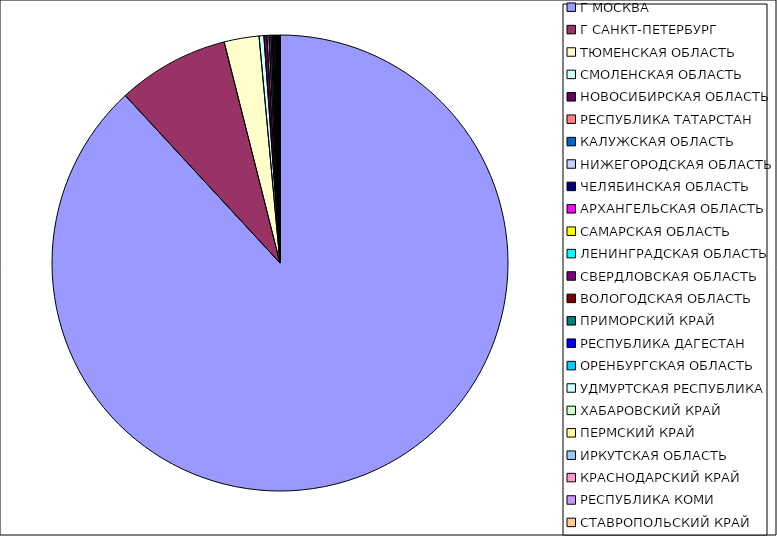
| Category | Оборот |
|---|---|
| Г МОСКВА | 0.881 |
| Г САНКТ-ПЕТЕРБУРГ | 0.079 |
| ТЮМЕНСКАЯ ОБЛАСТЬ | 0.025 |
| СМОЛЕНСКАЯ ОБЛАСТЬ | 0.003 |
| НОВОСИБИРСКАЯ ОБЛАСТЬ | 0.002 |
| РЕСПУБЛИКА ТАТАРСТАН | 0.001 |
| КАЛУЖСКАЯ ОБЛАСТЬ | 0.001 |
| НИЖЕГОРОДСКАЯ ОБЛАСТЬ | 0.001 |
| ЧЕЛЯБИНСКАЯ ОБЛАСТЬ | 0.001 |
| АРХАНГЕЛЬСКАЯ ОБЛАСТЬ | 0.001 |
| САМАРСКАЯ ОБЛАСТЬ | 0.001 |
| ЛЕНИНГРАДСКАЯ ОБЛАСТЬ | 0 |
| СВЕРДЛОВСКАЯ ОБЛАСТЬ | 0 |
| ВОЛОГОДСКАЯ ОБЛАСТЬ | 0 |
| ПРИМОРСКИЙ КРАЙ | 0 |
| РЕСПУБЛИКА ДАГЕСТАН | 0 |
| ОРЕНБУРГСКАЯ ОБЛАСТЬ | 0 |
| УДМУРТСКАЯ РЕСПУБЛИКА | 0 |
| ХАБАРОВСКИЙ КРАЙ | 0 |
| ПЕРМСКИЙ КРАЙ | 0 |
| ИРКУТСКАЯ ОБЛАСТЬ | 0 |
| КРАСНОДАРСКИЙ КРАЙ | 0 |
| РЕСПУБЛИКА КОМИ | 0 |
| СТАВРОПОЛЬСКИЙ КРАЙ | 0 |
| САРАТОВСКАЯ ОБЛАСТЬ | 0 |
| КАМЧАТСКИЙ КРАЙ | 0 |
| КАБАРДИНО-БАЛКАРСКАЯ РЕСПУБЛИКА | 0 |
| САХАЛИНСКАЯ ОБЛАСТЬ | 0 |
| РЕСПУБЛИКА БАШКОРТОСТАН | 0 |